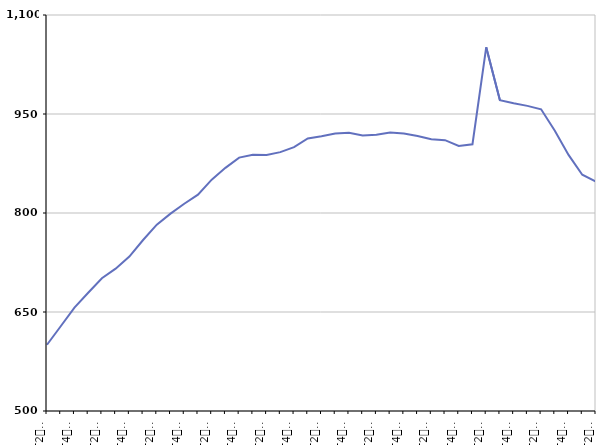
| Category | 50 ans ou plus |
|---|---|
| T2
2012 | 600.4 |
| T3
2012 | 628.4 |
| T4
2012 | 656.7 |
| T1
2013 | 679.1 |
| T2
2013 | 701.2 |
| T3
2013 | 715.7 |
| T4
2013 | 734 |
| T1
2014 | 759.1 |
| T2
2014 | 782.4 |
| T3
2014 | 799 |
| T4
2014 | 814 |
| T1
2015 | 827.8 |
| T2
2015 | 850.5 |
| T3
2015 | 868.4 |
| T4
2015 | 883.9 |
| T1
2016 | 888.3 |
| T2
2016 | 888 |
| T3
2016 | 892.2 |
| T4
2016 | 899.8 |
| T1
2017 | 912.9 |
| T2
2017 | 916.2 |
| T3
2017 | 920.6 |
| T4
2017 | 921.7 |
| T1
2018 | 917.6 |
| T2
2018 | 918.5 |
| T3
2018 | 922.1 |
| T4
2018 | 920.6 |
| T1
2019 | 916.7 |
| T2
2019 | 911.9 |
| T3
2019 | 910.4 |
| T4
2019 | 901.6 |
| T1
2020 | 904.2 |
| T2
2020 | 1051.1 |
| T3
2020 | 971 |
| T4
2020 | 966.3 |
| T1
2021 | 962.3 |
| T2
2021 | 957.1 |
| T3
2021 | 924.7 |
| T4
2021 | 888 |
| T1
2022 | 858 |
| T2
2022 | 847.5 |